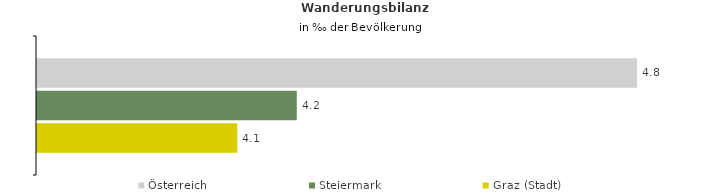
| Category | Österreich | Steiermark | Graz (Stadt) |
|---|---|---|---|
| Wanderungsrate in ‰ der Bevölkerung, Periode 2017-2021 | 4.789 | 4.172 | 4.064 |